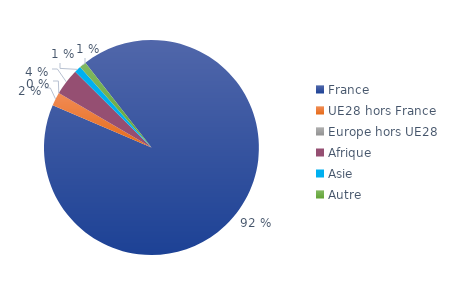
| Category | Series 0 |
|---|---|
| France | 0.92 |
| UE28 hors France | 0.02 |
| Europe hors UE28 | 0 |
| Afrique | 0.04 |
| Asie | 0.01 |
| Autre | 0.01 |